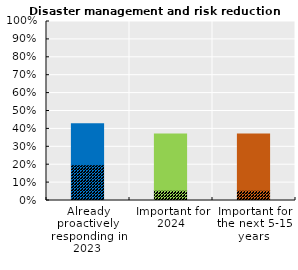
| Category | Disaster management and risk reduction | Series 1 |
|---|---|---|
| Already proactively responding in 2023 | 0.2 | 0.229 |
| Important for
2024 | 0.057 | 0.314 |
| Important for
the next 5-15 years | 0.057 | 0.314 |